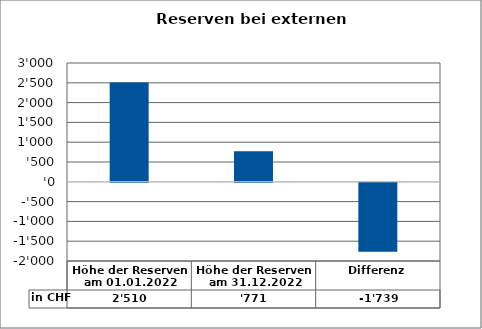
| Category | in CHF |
|---|---|
| Höhe der Reserven am 01.01.2022 | 2510 |
| Höhe der Reserven am 31.12.2022 | 771.44 |
| Differenz | -1738.56 |